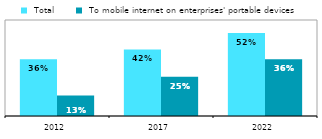
| Category |  Total |  To mobile internet on enterprises' portable devices |
|---|---|---|
| 2012.0 | 0.355 | 0.128 |
| 2017.0 | 0.416 | 0.246 |
| 2022.0 | 0.519 | 0.355 |